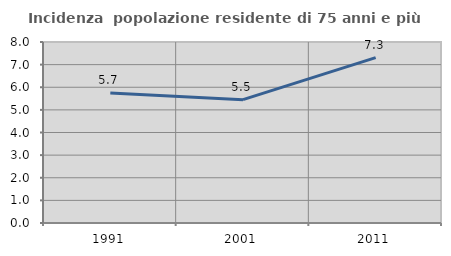
| Category | Incidenza  popolazione residente di 75 anni e più |
|---|---|
| 1991.0 | 5.743 |
| 2001.0 | 5.451 |
| 2011.0 | 7.311 |